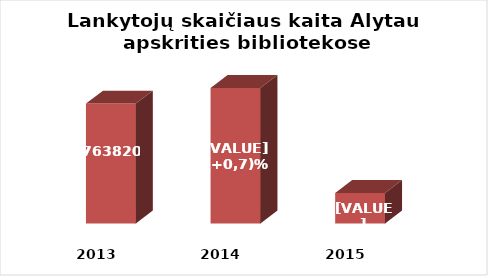
| Category | Series 0 |
|---|---|
| 2013.0 | 763820 |
| 2014.0 | 769520 |
| 2015.0 | 731161 |